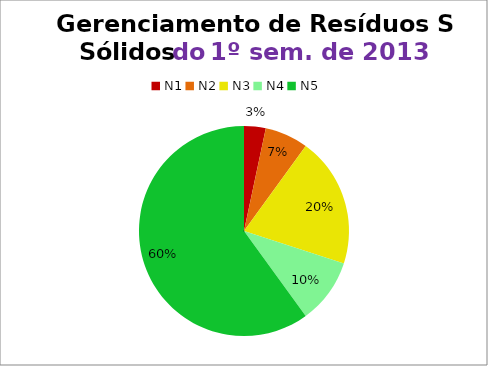
| Category | 1º/13 |
|---|---|
| N1 | 1 |
| N2 | 2 |
| N3 | 6 |
| N4 | 3 |
| N5 | 18 |